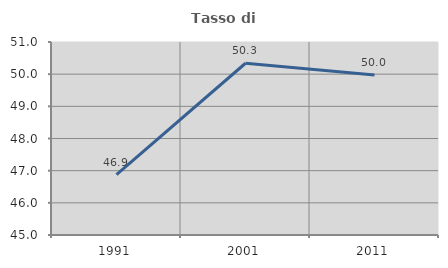
| Category | Tasso di occupazione   |
|---|---|
| 1991.0 | 46.877 |
| 2001.0 | 50.339 |
| 2011.0 | 49.971 |